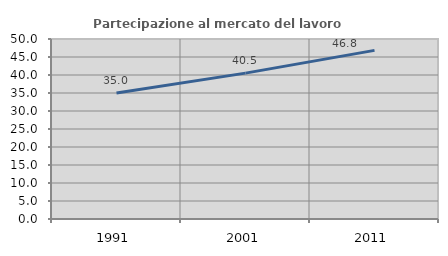
| Category | Partecipazione al mercato del lavoro  femminile |
|---|---|
| 1991.0 | 34.985 |
| 2001.0 | 40.519 |
| 2011.0 | 46.843 |